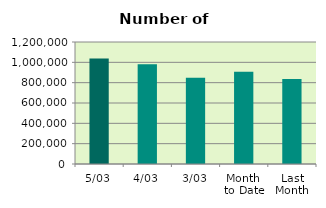
| Category | Series 0 |
|---|---|
| 5/03 | 1036580 |
| 4/03 | 981244 |
| 3/03 | 847648 |
| Month 
to Date | 906411.2 |
| Last
Month | 836497.7 |